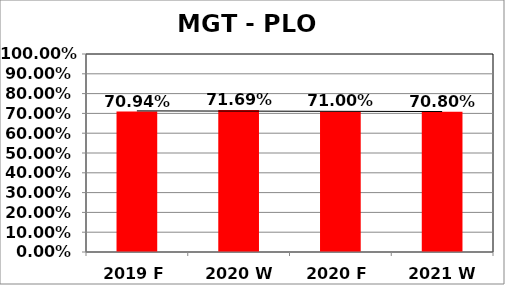
| Category | Series 0 |
|---|---|
| 2019 F | 0.709 |
| 2020 W | 0.717 |
| 2020 F | 0.71 |
| 2021 W | 0.708 |